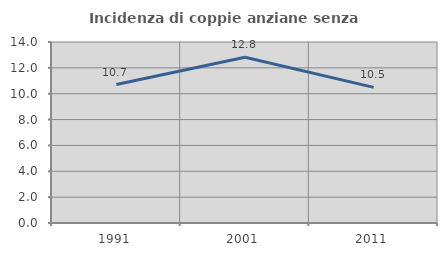
| Category | Incidenza di coppie anziane senza figli  |
|---|---|
| 1991.0 | 10.706 |
| 2001.0 | 12.821 |
| 2011.0 | 10.489 |